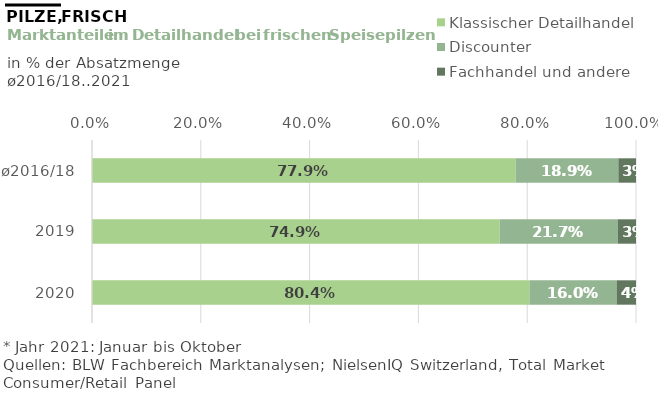
| Category | Klassischer Detailhandel | Discounter | Fachhandel und andere |
|---|---|---|---|
| ø2016/18 | 0.779 | 0.189 | 0.032 |
| 2019 | 0.749 | 0.217 | 0.034 |
| 2020 | 0.804 | 0.16 | 0.036 |